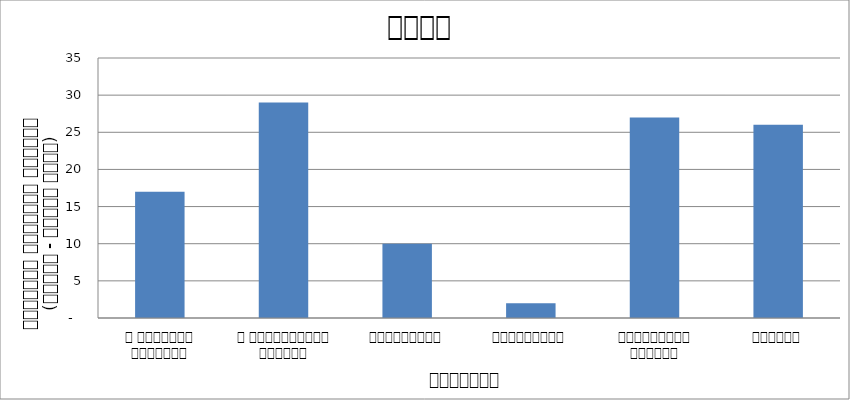
| Category | शासन |
|---|---|
| द हिमालयन टाइम्स् | 17 |
| द काठमाण्डौं पोस्ट् | 29 |
| रिपब्लिका | 10 |
| कान्तिपुर | 2 |
| अन्नपूर्ण पोस्ट् | 27 |
| नागरिक | 26 |